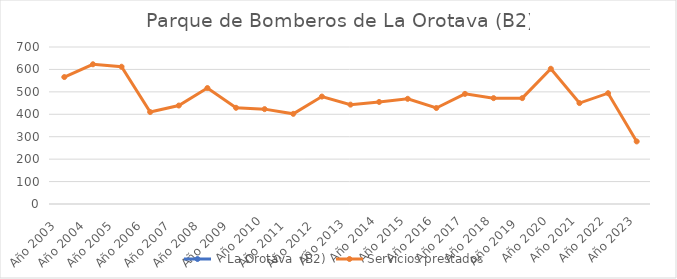
| Category |    La Orotava  (B2) | Servicios prestados  |
|---|---|---|
| Año 2003   |  | 566 |
| Año 2004   |  | 623 |
| Año 2005   |  | 612 |
| Año 2006   |  | 410 |
| Año 2007   |  | 439 |
| Año 2008   |  | 517 |
| Año 2009   |  | 429 |
| Año 2010 |  | 423 |
| Año 2011   |  | 402 |
| Año 2012   |  | 479 |
| Año 2013  |  | 443 |
| Año 2014 |  | 455 |
| Año 2015 |  | 469 |
| Año 2016 |  | 428 |
| Año 2017 |  | 491 |
| Año 2018 |  | 472 |
| Año 2019  |  | 472 |
| Año 2020 |  | 603 |
| Año 2021 |  | 450 |
| Año 2022 |  | 494 |
| Año 2023 |  | 279 |